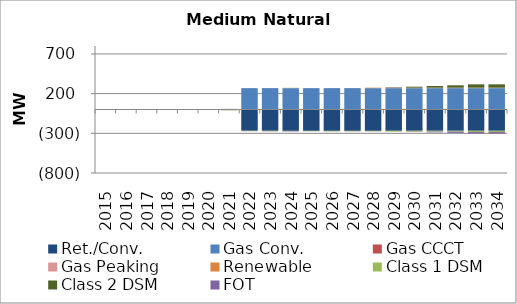
| Category | Ret./Conv. | Gas Conv. | Gas CCCT | Gas Peaking | Renewable | Class 1 DSM | Class 2 DSM | FOT |
|---|---|---|---|---|---|---|---|---|
| 2015.0 | 0 | 0 | 0 | 0 | 0 | 0 | -0.18 | 0.102 |
| 2016.0 | 0 | 0 | 0 | 0 | 0 | 0 | -0.09 | 0.032 |
| 2017.0 | 0 | 0 | 0 | 0 | 0 | 0 | -0.29 | 0.157 |
| 2018.0 | 0 | 0 | 0 | 0 | 0 | 0 | -0.29 | 0.2 |
| 2019.0 | 0 | 0 | 0 | 0 | 0 | 0 | -2.44 | -0.487 |
| 2020.0 | 0 | 0 | 0 | 0 | 0 | 0 | -2.35 | -0.98 |
| 2021.0 | 0 | 0 | 0 | 0 | 0 | -7.45 | -2.35 | 7.471 |
| 2022.0 | -268 | 269 | 0 | 0 | 0 | -2.43 | -2.36 | 0.511 |
| 2023.0 | -268 | 269 | 0 | 0 | 0 | -2.43 | -3.98 | 1.85 |
| 2024.0 | -268 | 269 | 0 | 0 | 0 | 4.46 | -4.4 | -4.549 |
| 2025.0 | -268 | 269 | 0 | 0 | 0 | -0.56 | -4.48 | 0.482 |
| 2026.0 | -268 | 269 | 0 | 0 | 0 | -0.63 | -5.66 | 1.244 |
| 2027.0 | -268 | 269 | 0 | 0 | 0 | -0.63 | -5.7 | 1.26 |
| 2028.0 | -268 | 269 | 0 | 0 | 6 | -0.63 | -5.61 | -0.273 |
| 2029.0 | -268 | 269 | 0 | 0 | 6 | -11.18 | 3.46 | 3.936 |
| 2030.0 | -268 | 269 | 0 | 0 | 6 | -11.18 | 12.39 | -2.605 |
| 2031.0 | -268 | 269 | 0 | 0 | 6 | -11.18 | 21.3 | -9.222 |
| 2032.0 | -268 | 269 | 0 | 0 | 6 | -11.18 | 29.77 | -15.494 |
| 2033.0 | -268 | 269 | 0 | 0 | 6 | -16.12 | 41.94 | -19.183 |
| 2034.0 | -268 | 269 | 0 | 0 | 6 | -16.12 | 41.96 | -19.328 |